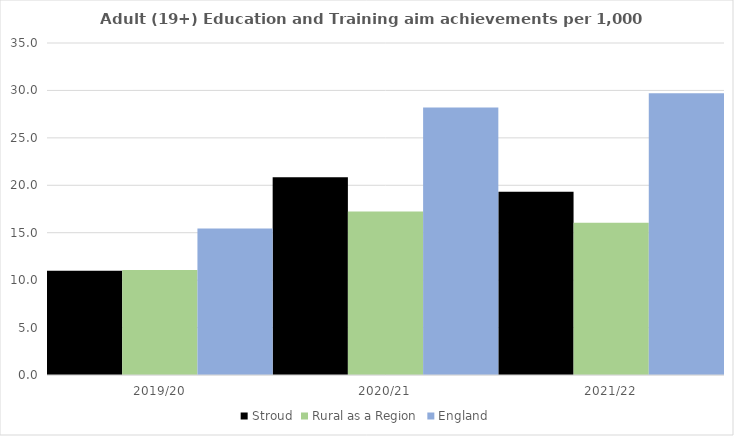
| Category | Stroud | Rural as a Region | England |
|---|---|---|---|
| 2019/20 | 11.002 | 11.081 | 15.446 |
| 2020/21 | 20.856 | 17.224 | 28.211 |
| 2021/22 | 19.326 | 16.063 | 29.711 |